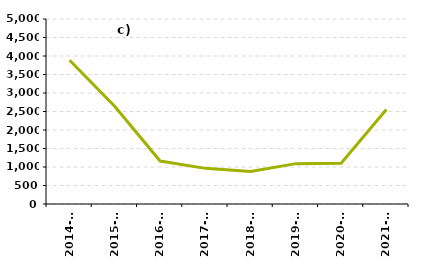
| Category | GSHP |
|---|---|
| 2014-15 | 3887 |
| 2015-16 | 2636 |
| 2016-17 | 1161 |
| 2017-18 | 963 |
| 2018-19 | 878 |
| 2019-20 | 1091 |
| 2020-21 | 1103 |
| 2021-22 | 2553 |